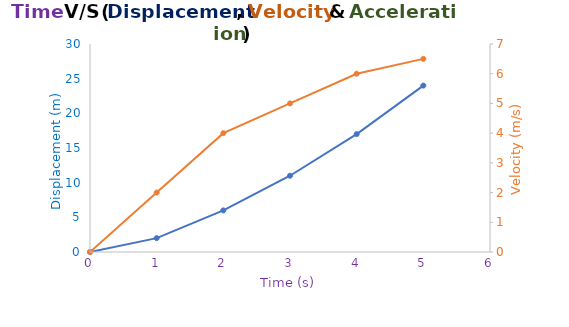
| Category | Displacement (m) |
|---|---|
| 0.0 | 0 |
| 1.0 | 2 |
| 2.0 | 6 |
| 3.0 | 11 |
| 4.0 | 17 |
| 5.0 | 24 |